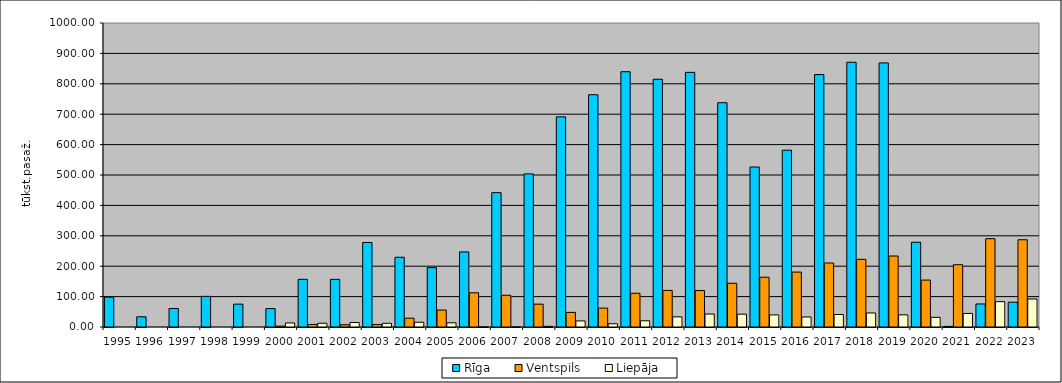
| Category | Rīga | Ventspils | Liepāja |
|---|---|---|---|
| 1995.0 | 98.19 | 0 | 0 |
| 1996.0 | 33.55 | 0 | 0 |
| 1997.0 | 60.88 | 0 | 0 |
| 1998.0 | 100.833 | 0 | 0 |
| 1999.0 | 75.147 | 0 | 0 |
| 2000.0 | 60.586 | 2.681 | 13.311 |
| 2001.0 | 156.77 | 8.37 | 12.356 |
| 2002.0 | 156.77 | 7.404 | 14.786 |
| 2003.0 | 278.028 | 8.032 | 12.162 |
| 2004.0 | 229.474 | 28.887 | 15.53 |
| 2005.0 | 195.195 | 55.788 | 13.812 |
| 2006.0 | 246.885 | 112.46 | 0.153 |
| 2007.0 | 441.914 | 104.422 | 0.116 |
| 2008.0 | 503.594 | 75.174 | 2.115 |
| 2009.0 | 691.236 | 48.012 | 20.041 |
| 2010.0 | 764.001 | 62.109 | 10.674 |
| 2011.0 | 839.712 | 111.019 | 20.432 |
| 2012.0 | 815.026 | 120.344 | 33.361 |
| 2013.0 | 837.665 | 120.014 | 42.607 |
| 2014.0 | 737.865 | 143.891 | 42.203 |
| 2015.0 | 526.243 | 163.666 | 39.782 |
| 2016.0 | 581.577 | 180.632 | 32.992 |
| 2017.0 | 830.38 | 210.532 | 41.111 |
| 2018.0 | 870.825 | 222.562 | 46.113 |
| 2019.0 | 868.656 | 233.537 | 39.987 |
| 2020.0 | 278.759 | 154.347 | 31.731 |
| 2021.0 | 2.005 | 204.843 | 44.612 |
| 2022.0 | 75.73 | 290.457 | 83.323 |
| 2023.0 | 81.591 | 286.967 | 92.089 |